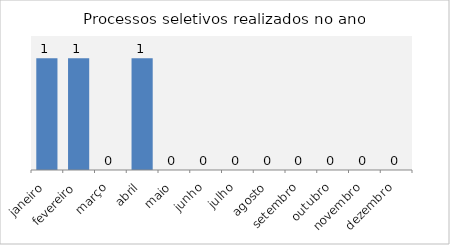
| Category | Processos seletivos |
|---|---|
| janeiro | 1 |
| fevereiro | 1 |
| março | 0 |
| abril | 1 |
| maio | 0 |
| junho | 0 |
| julho | 0 |
| agosto | 0 |
| setembro | 0 |
| outubro | 0 |
| novembro | 0 |
| dezembro | 0 |